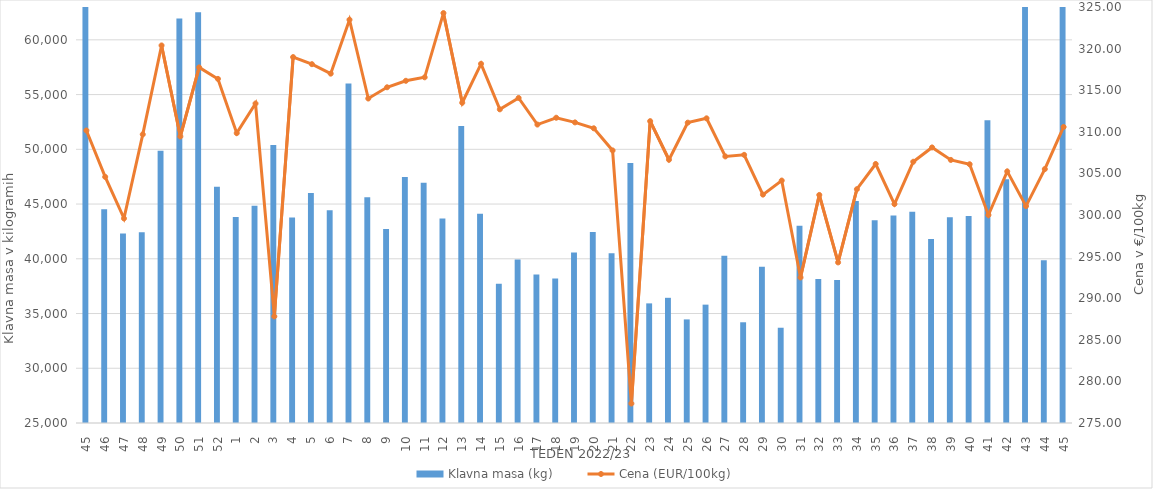
| Category | Klavna masa (kg) |
|---|---|
| 45.0 | 63668 |
| 46.0 | 44528 |
| 47.0 | 42319 |
| 48.0 | 42416 |
| 49.0 | 49873 |
| 50.0 | 61942 |
| 51.0 | 62514 |
| 52.0 | 46589 |
| 1.0 | 43807 |
| 2.0 | 44834 |
| 3.0 | 50386 |
| 4.0 | 43773 |
| 5.0 | 46011 |
| 6.0 | 44439 |
| 7.0 | 56001 |
| 8.0 | 45613 |
| 9.0 | 42730 |
| 10.0 | 47471 |
| 11.0 | 46952 |
| 12.0 | 43683 |
| 13.0 | 52135 |
| 14.0 | 44103 |
| 15.0 | 37719 |
| 16.0 | 39943 |
| 17.0 | 38574 |
| 18.0 | 38200 |
| 19.0 | 40581 |
| 20.0 | 42443 |
| 21.0 | 40517 |
| 22.0 | 48742 |
| 23.0 | 35927 |
| 24.0 | 36436 |
| 25.0 | 34463 |
| 26.0 | 35812 |
| 27.0 | 40280 |
| 28.0 | 34201 |
| 29.0 | 39279 |
| 30.0 | 33702 |
| 31.0 | 43020 |
| 32.0 | 38146 |
| 33.0 | 38070 |
| 34.0 | 45290 |
| 35.0 | 43513 |
| 36.0 | 43945 |
| 37.0 | 44302 |
| 38.0 | 41798 |
| 39.0 | 43790 |
| 40.0 | 43913 |
| 41.0 | 52663 |
| 42.0 | 47275 |
| 43.0 | 68419 |
| 44.0 | 39872 |
| 45.0 | 81439 |